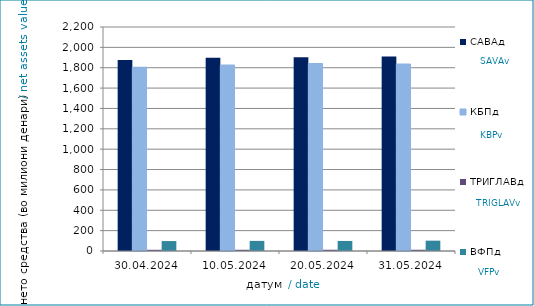
| Category | САВАд | КБПд | ТРИГЛАВд | ВФПд |
|---|---|---|---|---|
| 2024-04-30 | 1875.873 | 1804.615 | 11.783 | 97.632 |
| 2024-05-10 | 1898.107 | 1826.609 | 12.025 | 99.234 |
| 2024-05-20 | 1903.201 | 1841.334 | 12.107 | 98.663 |
| 2024-05-31 | 1911.352 | 1836.38 | 12.111 | 101.553 |